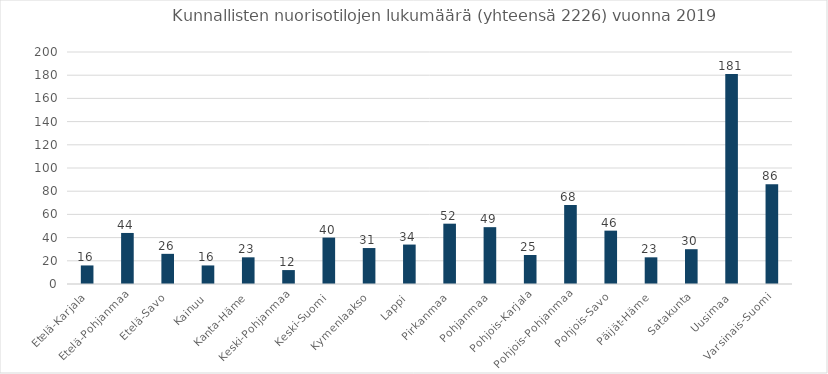
| Category | Kunnallisten nuorisotilojen lukumäärä 2019 |
|---|---|
| Etelä-Karjala | 16 |
| Etelä-Pohjanmaa | 44 |
| Etelä-Savo | 26 |
| Kainuu | 16 |
| Kanta-Häme | 23 |
| Keski-Pohjanmaa | 12 |
| Keski-Suomi | 40 |
| Kymenlaakso | 31 |
| Lappi | 34 |
| Pirkanmaa | 52 |
| Pohjanmaa | 49 |
| Pohjois-Karjala | 25 |
| Pohjois-Pohjanmaa | 68 |
| Pohjois-Savo | 46 |
| Päijät-Häme | 23 |
| Satakunta | 30 |
| Uusimaa | 181 |
| Varsinais-Suomi | 86 |